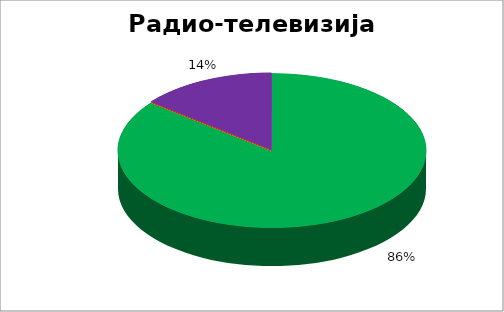
| Category | Радио-телевизија Војводине  |
|---|---|
| 0 | 0.857 |
| 1 | 0 |
| 2 | 0 |
| 3 | 0 |
| 4 | 0.143 |